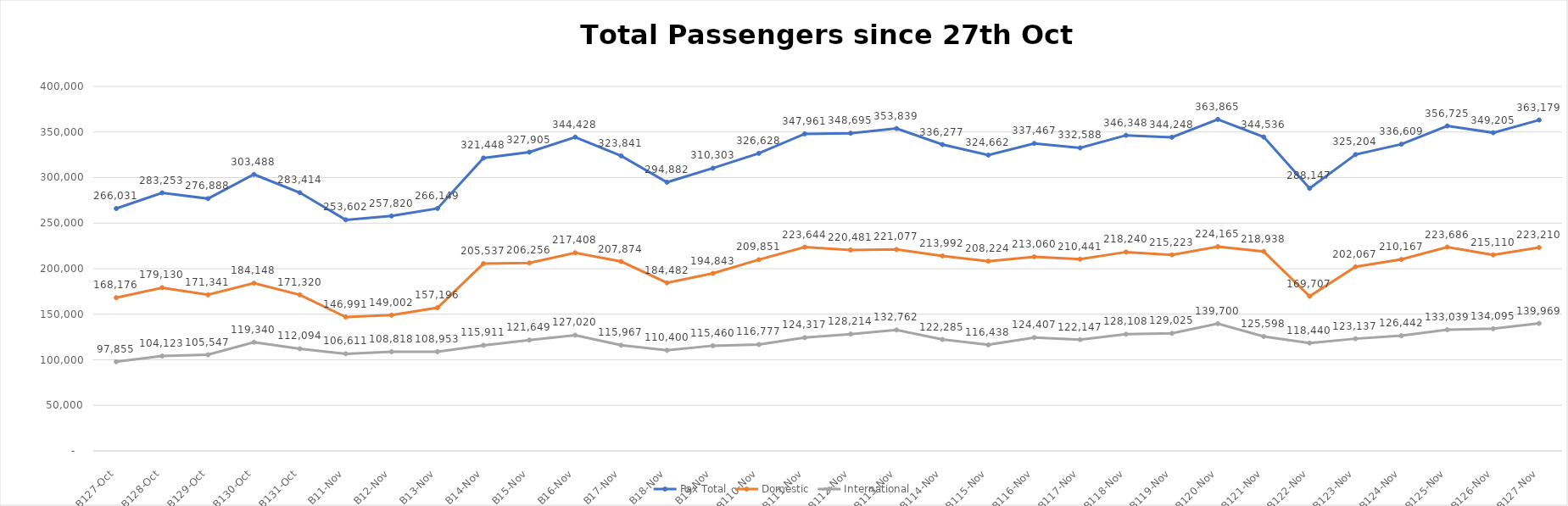
| Category | Pax Total |  Domestic  |  International  |
|---|---|---|---|
| 2022-10-27 | 266031 | 168176 | 97855 |
| 2022-10-28 | 283253 | 179130 | 104123 |
| 2022-10-29 | 276888 | 171341 | 105547 |
| 2022-10-30 | 303488 | 184148 | 119340 |
| 2022-10-31 | 283414 | 171320 | 112094 |
| 2022-11-01 | 253602 | 146991 | 106611 |
| 2022-11-02 | 257820 | 149002 | 108818 |
| 2022-11-03 | 266149 | 157196 | 108953 |
| 2022-11-04 | 321448 | 205537 | 115911 |
| 2022-11-05 | 327905 | 206256 | 121649 |
| 2022-11-06 | 344428 | 217408 | 127020 |
| 2022-11-07 | 323841 | 207874 | 115967 |
| 2022-11-08 | 294882 | 184482 | 110400 |
| 2022-11-09 | 310303 | 194843 | 115460 |
| 2022-11-10 | 326628 | 209851 | 116777 |
| 2022-11-11 | 347961 | 223644 | 124317 |
| 2022-11-12 | 348695 | 220481 | 128214 |
| 2022-11-13 | 353839 | 221077 | 132762 |
| 2022-11-14 | 336277 | 213992 | 122285 |
| 2022-11-15 | 324662 | 208224 | 116438 |
| 2022-11-16 | 337467 | 213060 | 124407 |
| 2022-11-17 | 332588 | 210441 | 122147 |
| 2022-11-18 | 346348 | 218240 | 128108 |
| 2022-11-19 | 344248 | 215223 | 129025 |
| 2022-11-20 | 363865 | 224165 | 139700 |
| 2022-11-21 | 344536 | 218938 | 125598 |
| 2022-11-22 | 288147 | 169707 | 118440 |
| 2022-11-23 | 325204 | 202067 | 123137 |
| 2022-11-24 | 336609 | 210167 | 126442 |
| 2022-11-25 | 356725 | 223686 | 133039 |
| 2022-11-26 | 349205 | 215110 | 134095 |
| 2022-11-27 | 363179 | 223210 | 139969 |